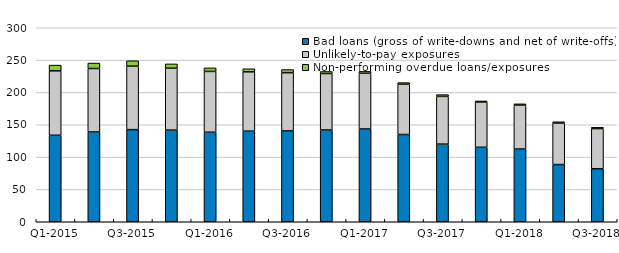
| Category | Bad loans (gross of write-downs and net of write-offs) | Unlikely-to-pay exposures | Non-performing overdue loans/exposures |
|---|---|---|---|
| Q1-2015 | 133.742 | 99.673 | 8.828 |
| Q2-2015 | 138.845 | 98.163 | 8.42 |
| Q3-2015 | 142.481 | 98.126 | 8.349 |
| Q4-2015 | 141.746 | 95.688 | 6.694 |
| Q1-2016 | 138.396 | 94.093 | 5.463 |
| Q2-2016 | 140.032 | 91.849 | 4.701 |
| Q3-2016 | 140.479 | 90.058 | 4.807 |
| Q4-2016 | 141.917 | 87.275 | 3.2 |
| Q1-2017 | 143.463 | 86.105 | 2.983 |
| Q2-2017 | 134.943 | 77.64 | 2.605 |
| Q3-2017 | 120.038 | 73.827 | 2.703 |
| Q4-2017 | 115.142 | 69.881 | 1.793 |
| Q1-2018 | 112.451 | 67.911 | 1.996 |
| Q2-2018 | 88.462 | 64.079 | 2.069 |
| Q3-2018 | 81.966 | 62.095 | 2.001 |